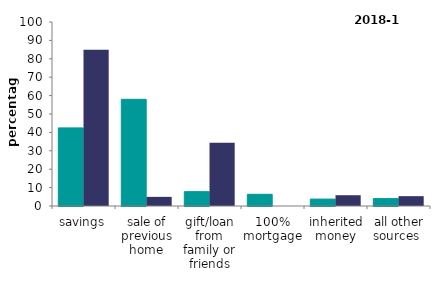
| Category | not first time buyer  | first time buyer |
|---|---|---|
| savings | 42.451 | 84.853 |
| sale of previous home | 57.983 | 4.968 |
| gift/loan from family or friends | 7.795 | 34.423 |
| 100% mortgage | 6.377 | 0 |
| inherited money | 3.758 | 5.857 |
| all other sources  | 4.018 | 5.344 |